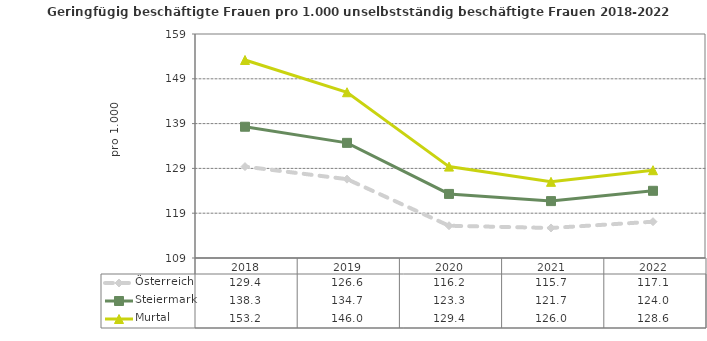
| Category | Österreich | Steiermark | Murtal |
|---|---|---|---|
| 2022.0 | 117.1 | 124 | 128.6 |
| 2021.0 | 115.7 | 121.7 | 126 |
| 2020.0 | 116.2 | 123.3 | 129.4 |
| 2019.0 | 126.6 | 134.7 | 146 |
| 2018.0 | 129.4 | 138.3 | 153.2 |